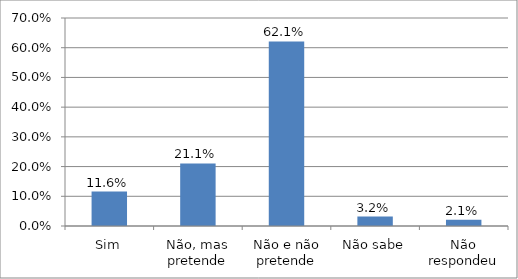
| Category | Series 0 |
|---|---|
| Sim | 0.116 |
| Não, mas pretende | 0.211 |
| Não e não pretende | 0.621 |
| Não sabe | 0.032 |
| Não respondeu | 0.021 |